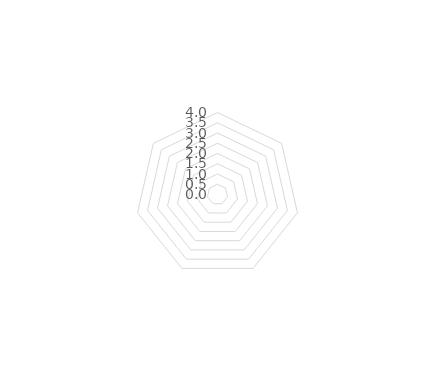
| Category | Series 1 | Series 0 |
|---|---|---|
| 1. Stratégie et Gouvernance | 0 | 0 |
| 2. Mesure | 0 | 0 |
| 3. Achat | 0 | 0 |
| 4. Transformation du numérique | 0 | 0 |
| 5. DEEE et Economie circulaire | 0 | 0 |
| 6. Sensibilisation | 0 | 0 |
| 7. Numérique pour une Collectivité Eco-responsable | 0 | 0 |